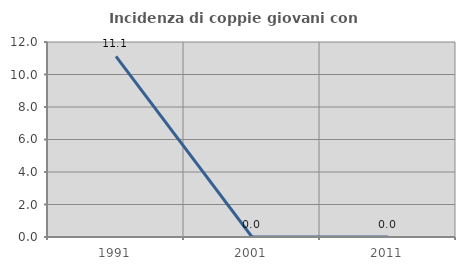
| Category | Incidenza di coppie giovani con figli |
|---|---|
| 1991.0 | 11.111 |
| 2001.0 | 0 |
| 2011.0 | 0 |